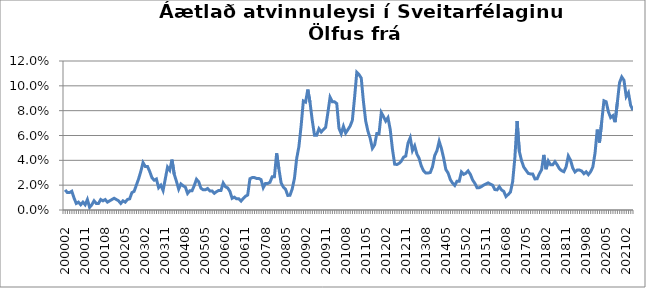
| Category | Series 0 |
|---|---|
| 200002 | 0.016 |
| 200003 | 0.014 |
| 200004 | 0.014 |
| 200005 | 0.015 |
| 200006 | 0.01 |
| 200007 | 0.005 |
| 200008 | 0.006 |
| 200009 | 0.004 |
| 200010 | 0.006 |
| 200011 | 0.004 |
| 200012 | 0.008 |
| 200101 | 0.002 |
| 200102 | 0.004 |
| 200103 | 0.007 |
| 200104 | 0.005 |
| 200105 | 0.005 |
| 200106 | 0.008 |
| 200107 | 0.007 |
| 200108 | 0.008 |
| 200109 | 0.006 |
| 200110 | 0.007 |
| 200111 | 0.008 |
| 200112 | 0.009 |
| 200201 | 0.008 |
| 200202 | 0.007 |
| 200203 | 0.005 |
| 200204 | 0.007 |
| 200205 | 0.006 |
| 200206 | 0.008 |
| 200207 | 0.009 |
| 200208 | 0.014 |
| 200209 | 0.015 |
| 200210 | 0.02 |
| 200211 | 0.025 |
| 200212 | 0.031 |
| 200301 | 0.038 |
| 200302 | 0.035 |
| 200303 | 0.035 |
| 200304 | 0.031 |
| 200305 | 0.026 |
| 200306 | 0.024 |
| 200307 | 0.025 |
| 200308 | 0.018 |
| 200309 | 0.02 |
| 200310 | 0.016 |
| 200311 | 0.025 |
| 200312 | 0.035 |
| 200401 | 0.032 |
| 200402 | 0.041 |
| 200403 | 0.029 |
| 200404 | 0.023 |
| 200405 | 0.017 |
| 200406 | 0.021 |
| 200407 | 0.019 |
| 200408 | 0.018 |
| 200409 | 0.013 |
| 200410 | 0.016 |
| 200411 | 0.016 |
| 200412 | 0.02 |
| 200501 | 0.025 |
| 200502 | 0.023 |
| 200503 | 0.018 |
| 200504 | 0.016 |
| 200505 | 0.016 |
| 200506 | 0.017 |
| 200507 | 0.015 |
| 200508 | 0.015 |
| 200509 | 0.013 |
| 200510 | 0.015 |
| 200511 | 0.016 |
| 200512 | 0.016 |
| 200601 | 0.022 |
| 200602 | 0.019 |
| 200603 | 0.018 |
| 200604 | 0.015 |
| 200605 | 0.009 |
| 200606 | 0.01 |
| 200607 | 0.009 |
| 200608 | 0.009 |
| 200609 | 0.007 |
| 200610 | 0.009 |
| 200611 | 0.011 |
| 200612 | 0.012 |
| 200701 | 0.025 |
| 200702 | 0.026 |
| 200703 | 0.026 |
| 200704 | 0.025 |
| 200705 | 0.025 |
| 200706 | 0.024 |
| 200707 | 0.018 |
| 200708 | 0.021 |
| 200709 | 0.021 |
| 200710 | 0.022 |
| 200711 | 0.027 |
| 200712 | 0.027 |
| 200801 | 0.046 |
| 200802 | 0.033 |
| 200803 | 0.022 |
| 200804 | 0.018 |
| 200805 | 0.017 |
| 200806 | 0.012 |
| 200807 | 0.012 |
| 200808 | 0.017 |
| 200809 | 0.025 |
| 200810 | 0.041 |
| 200811 | 0.051 |
| 200812 | 0.068 |
| 200901 | 0.088 |
| 200902 | 0.087 |
| 200903 | 0.097 |
| 200904 | 0.087 |
| 200905 | 0.072 |
| 200906 | 0.06 |
| 200907 | 0.06 |
| 200908 | 0.065 |
| 200909 | 0.063 |
| 200910 | 0.065 |
| 200911 | 0.066 |
| 200912 | 0.078 |
| 201001 | 0.091 |
| 201002 | 0.087 |
| 201003 | 0.087 |
| 201004 | 0.086 |
| 201005 | 0.066 |
| 201006 | 0.061 |
| 201007 | 0.067 |
| 201008 | 0.062 |
| 201009 | 0.065 |
| 201010 | 0.068 |
| 201011 | 0.072 |
| 201012 | 0.09 |
| 201101 | 0.111 |
| 201102 | 0.109 |
| 201103 | 0.106 |
| 201104 | 0.087 |
| 201105 | 0.072 |
| 201106 | 0.063 |
| 201107 | 0.058 |
| 201108 | 0.05 |
| 201109 | 0.052 |
| 201110 | 0.062 |
| 201111 | 0.062 |
| 201112 | 0.079 |
| 201201 | 0.075 |
| 201202 | 0.072 |
| 201203 | 0.074 |
| 201204 | 0.065 |
| 201205 | 0.049 |
| 201206 | 0.037 |
| 201207 | 0.037 |
| 201208 | 0.038 |
| 201209 | 0.039 |
| 201210 | 0.043 |
| 201211 | 0.043 |
| 201212 | 0.054 |
| 201301 | 0.058 |
| 201302 | 0.048 |
| 201303 | 0.052 |
| 201304 | 0.045 |
| 201305 | 0.042 |
| 201306 | 0.035 |
| 201307 | 0.032 |
| 201308 | 0.03 |
| 201309 | 0.03 |
| 201310 | 0.03 |
| 201311 | 0.035 |
| 201312 | 0.044 |
| 201401 | 0.048 |
| 201402 | 0.055 |
| 201403 | 0.05 |
| 201404 | 0.042 |
| 201405 | 0.033 |
| 201406 | 0.03 |
| 201407 | 0.024 |
| 201408 | 0.022 |
| 201409 | 0.02 |
| 201410 | 0.023 |
| 201411 | 0.023 |
| 201412 | 0.031 |
| 201501 | 0.029 |
| 201502 | 0.03 |
| 201503 | 0.031 |
| 201504 | 0.029 |
| 201505 | 0.024 |
| 201506 | 0.022 |
| 201507 | 0.018 |
| 201508 | 0.018 |
| 201509 | 0.019 |
| 201510 | 0.02 |
| 201511 | 0.021 |
| 201512 | 0.022 |
| 201601 | 0.021 |
| 201602 | 0.02 |
| 201603 | 0.016 |
| 201604 | 0.016 |
| 201605 | 0.019 |
| 201606 | 0.016 |
| 201607 | 0.015 |
| 201608 | 0.011 |
| 201609 | 0.013 |
| 201610 | 0.014 |
| 201611 | 0.023 |
| 201612 | 0.042 |
| 201701 | 0.072 |
| 201702 | 0.047 |
| 201703 | 0.04 |
| 201704 | 0.035 |
| 201705 | 0.032 |
| 201706 | 0.029 |
| 201707 | 0.029 |
| 201708 | 0.029 |
| 201709 | 0.025 |
| 201710 | 0.025 |
| 201711 | 0.029 |
| 201712 | 0.032 |
| 201801 | 0.044 |
| 201802 | 0.033 |
| 201803 | 0.039 |
| 201804 | 0.036 |
| 201805 | 0.036 |
| 201806 | 0.039 |
| 201807 | 0.036 |
| 201808 | 0.033 |
| 201809 | 0.032 |
| 201810 | 0.031 |
| 201811 | 0.035 |
| 201812 | 0.043 |
| 201901 | 0.04 |
| 201902 | 0.034 |
| 201903 | 0.031 |
| 201904 | 0.032 |
| 201905 | 0.032 |
| 201906 | 0.031 |
| 201907 | 0.029 |
| 201908 | 0.031 |
| 201909 | 0.028 |
| 201910 | 0.031 |
| 201911 | 0.035 |
| 201912 | 0.046 |
| 202001 | 0.065 |
| 202002 | 0.054 |
| 202003 | 0.071 |
| 202004 | 0.088 |
| 202005 | 0.087 |
| 202006 | 0.079 |
| 202007 | 0.074 |
| 202008 | 0.076 |
| 202009 | 0.071 |
| 202010 | 0.086 |
| 202011 | 0.103 |
| 202012 | 0.107 |
| 202101 | 0.104 |
| 202102 | 0.091 |
| 202103 | 0.094 |
| 202104 | 0.084 |
| 202105 | 0.08 |